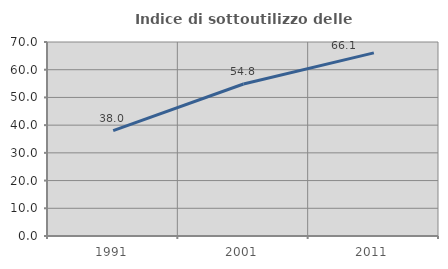
| Category | Indice di sottoutilizzo delle abitazioni  |
|---|---|
| 1991.0 | 38.028 |
| 2001.0 | 54.839 |
| 2011.0 | 66.071 |